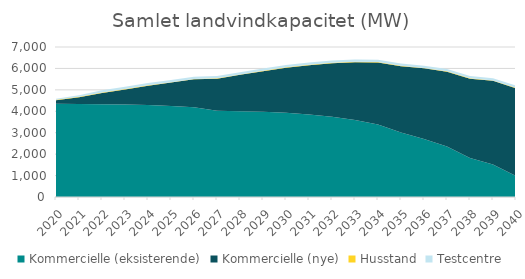
| Category | Kommercielle (eksisterende) | Kommercielle (nye) | Husstand | Testcentre |
|---|---|---|---|---|
| 2020.0 | 4350.214 | 170.2 | 18.356 | 43 |
| 2021.0 | 4338.619 | 321.4 | 18.453 | 75 |
| 2022.0 | 4332.11 | 521.9 | 18.549 | 105 |
| 2023.0 | 4321.965 | 698.5 | 18.646 | 105 |
| 2024.0 | 4297.981 | 898.5 | 18.743 | 105 |
| 2025.0 | 4242.552 | 1098.5 | 18.84 | 105 |
| 2026.0 | 4193.467 | 1298.5 | 18.937 | 105 |
| 2027.0 | 4024.967 | 1498.5 | 19.034 | 105 |
| 2028.0 | 4003.692 | 1698.5 | 19.131 | 105 |
| 2029.0 | 3973.412 | 1898.5 | 19.228 | 105 |
| 2030.0 | 3933.762 | 2098.5 | 19.324 | 105 |
| 2031.0 | 3851.887 | 2298.5 | 19.421 | 105 |
| 2032.0 | 3742.812 | 2498.5 | 19.518 | 105 |
| 2033.0 | 3593.044 | 2698.5 | 19.615 | 105 |
| 2034.0 | 3382.164 | 2898.5 | 19.712 | 105 |
| 2035.0 | 3005.48 | 3098.5 | 19.809 | 105 |
| 2036.0 | 2704.77 | 3298.5 | 19.906 | 105 |
| 2037.0 | 2350.965 | 3498.5 | 20.003 | 105 |
| 2038.0 | 1819.05 | 3698.5 | 20.1 | 105 |
| 2039.0 | 1521.79 | 3898.5 | 20.196 | 105 |
| 2040.0 | 977.105 | 4098.5 | 20.293 | 105 |